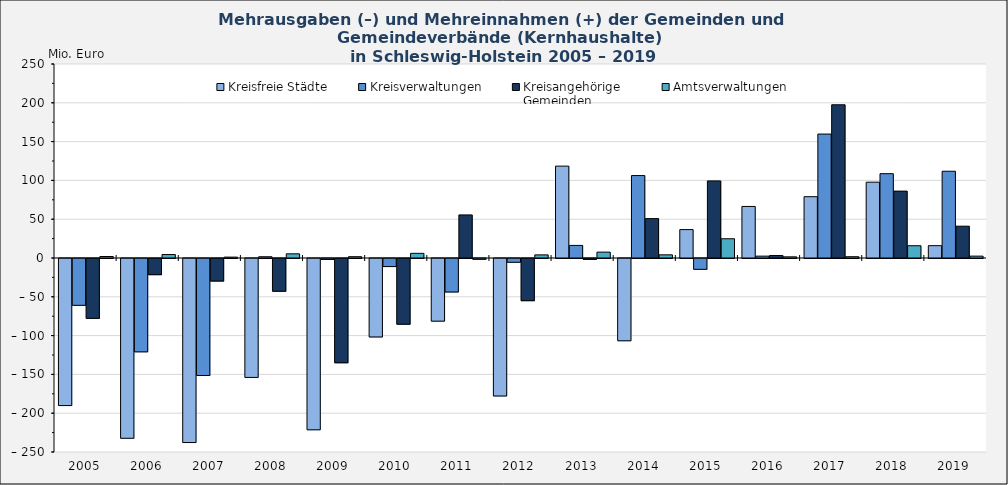
| Category | Kreisfreie Städte | Kreisverwaltungen | Kreisangehörige 
Gemeinden | Amtsverwaltungen |
|---|---|---|---|---|
| 2005-12-31 | -189.524 | -60.352 | -77.146 | 1.931 |
| 2006-12-31 | -231.686 | -120.314 | -20.826 | 4.455 |
| 2007-12-31 | -237.135 | -150.758 | -29.064 | 1.146 |
| 2008-12-31 | -153.251 | 1.626 | -42.212 | 5.387 |
| 2009-12-31 | -220.757 | -1.232 | -134.35 | 1.68 |
| 2010-12-31 | -101.125 | -10.386 | -84.657 | 6.013 |
| 2011-12-31 | -80.756 | -43.174 | 55.5 | -1.075 |
| 2012-12-31 | -177.204 | -4.886 | -54.348 | 4.027 |
| 2013-12-31 | 118.38 | 16.222 | -1.152 | 7.552 |
| 2014-12-31 | -106.044 | 106.235 | 50.765 | 4.086 |
| 2015-12-31 | 36.607 | -13.969 | 99.364 | 24.797 |
| 2016-12-31 | 66.425 | 2.397 | 3.237 | 1.497 |
| 2017-12-31 | 78.993 | 159.727 | 197.453 | 1.664 |
| 2018-12-31 | 97.704 | 108.661 | 86.188 | 15.811 |
| 2019-12-31 | 15.905 | 111.804 | 40.992 | 2.4 |